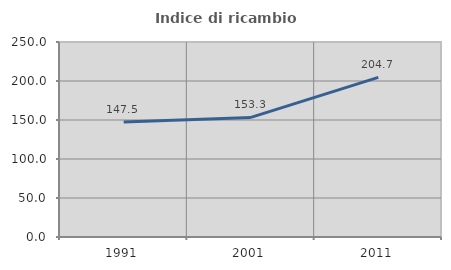
| Category | Indice di ricambio occupazionale  |
|---|---|
| 1991.0 | 147.493 |
| 2001.0 | 153.292 |
| 2011.0 | 204.722 |